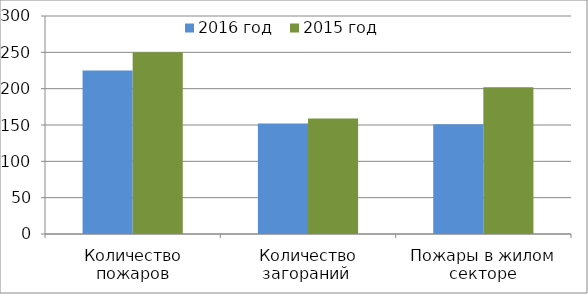
| Category | 2016 год | 2015 год |
|---|---|---|
| Количество пожаров | 225 | 250 |
| Количество загораний  | 152 | 159 |
| Пожары в жилом секторе | 151 | 202 |